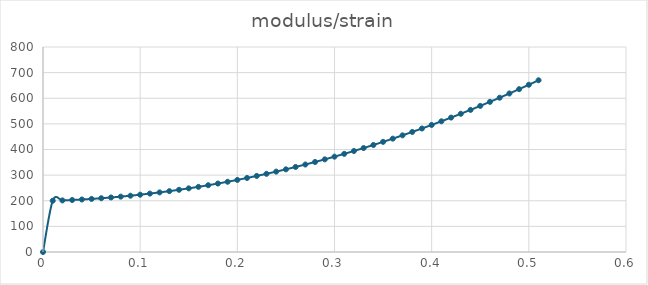
| Category | Series 0 |
|---|---|
| 0.0 | 0 |
| 0.01 | 200 |
| 0.02 | 201.287 |
| 0.03 | 202.926 |
| 0.04 | 204.895 |
| 0.05 | 207.195 |
| 0.060000000000000005 | 209.825 |
| 0.07 | 212.786 |
| 0.08 | 216.077 |
| 0.09 | 219.698 |
| 0.09999999999999999 | 223.65 |
| 0.10999999999999999 | 227.932 |
| 0.11999999999999998 | 232.545 |
| 0.12999999999999998 | 237.488 |
| 0.13999999999999999 | 242.761 |
| 0.15 | 248.365 |
| 0.16 | 254.299 |
| 0.17 | 260.564 |
| 0.18000000000000002 | 267.159 |
| 0.19000000000000003 | 274.084 |
| 0.20000000000000004 | 281.34 |
| 0.21000000000000005 | 288.926 |
| 0.22000000000000006 | 296.843 |
| 0.23000000000000007 | 305.09 |
| 0.24000000000000007 | 313.667 |
| 0.25000000000000006 | 322.575 |
| 0.26000000000000006 | 331.813 |
| 0.2700000000000001 | 341.382 |
| 0.2800000000000001 | 351.281 |
| 0.2900000000000001 | 361.51 |
| 0.3000000000000001 | 372.07 |
| 0.3100000000000001 | 382.96 |
| 0.3200000000000001 | 394.181 |
| 0.3300000000000001 | 405.732 |
| 0.34000000000000014 | 417.613 |
| 0.35000000000000014 | 429.825 |
| 0.36000000000000015 | 442.367 |
| 0.37000000000000016 | 455.24 |
| 0.38000000000000017 | 468.443 |
| 0.3900000000000002 | 481.976 |
| 0.4000000000000002 | 495.84 |
| 0.4100000000000002 | 510.034 |
| 0.4200000000000002 | 524.559 |
| 0.4300000000000002 | 539.414 |
| 0.4400000000000002 | 554.599 |
| 0.45000000000000023 | 570.115 |
| 0.46000000000000024 | 585.961 |
| 0.47000000000000025 | 602.138 |
| 0.48000000000000026 | 618.645 |
| 0.49000000000000027 | 635.482 |
| 0.5000000000000002 | 652.65 |
| 0.5100000000000002 | 670.148 |